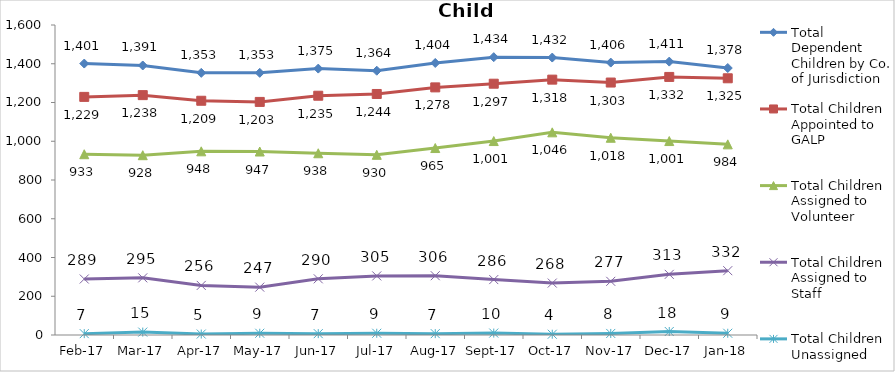
| Category | Total Dependent Children by Co. of Jurisdiction | Total Children Appointed to GALP | Total Children Assigned to Volunteer | Total Children Assigned to Staff | Total Children Unassigned |
|---|---|---|---|---|---|
| 2017-02-01 | 1401 | 1229 | 933 | 289 | 7 |
| 2017-03-01 | 1391 | 1238 | 928 | 295 | 15 |
| 2017-04-01 | 1353 | 1209 | 948 | 256 | 5 |
| 2017-05-01 | 1353 | 1203 | 947 | 247 | 9 |
| 2017-06-01 | 1375 | 1235 | 938 | 290 | 7 |
| 2017-07-01 | 1364 | 1244 | 930 | 305 | 9 |
| 2017-08-01 | 1404 | 1278 | 965 | 306 | 7 |
| 2017-09-01 | 1434 | 1297 | 1001 | 286 | 10 |
| 2017-10-01 | 1432 | 1318 | 1046 | 268 | 4 |
| 2017-11-01 | 1406 | 1303 | 1018 | 277 | 8 |
| 2017-12-01 | 1411 | 1332 | 1001 | 313 | 18 |
| 2018-01-01 | 1378 | 1325 | 984 | 332 | 9 |